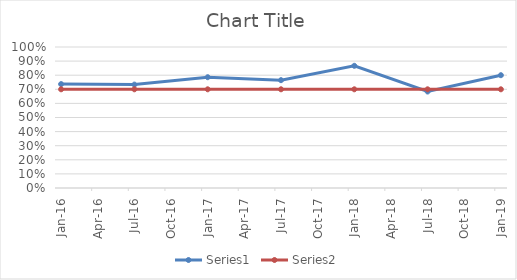
| Category | Series 0 | Series 1 |
|---|---|---|
| 2016-01-01 | 0.737 | 0.7 |
| 2016-07-01 | 0.733 | 0.7 |
| 2017-01-01 | 0.786 | 0.7 |
| 2017-07-01 | 0.765 | 0.7 |
| 2018-01-01 | 0.867 | 0.7 |
| 2018-07-01 | 0.684 | 0.7 |
| 2019-01-01 | 0.8 | 0.7 |